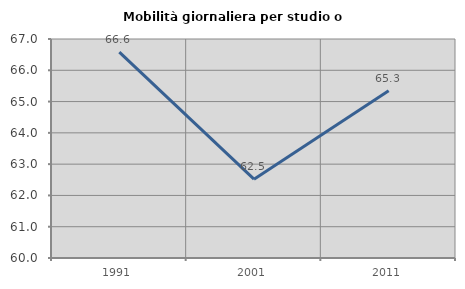
| Category | Mobilità giornaliera per studio o lavoro |
|---|---|
| 1991.0 | 66.578 |
| 2001.0 | 62.521 |
| 2011.0 | 65.344 |